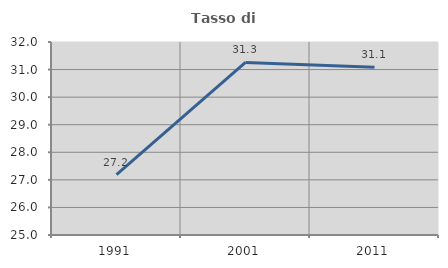
| Category | Tasso di occupazione   |
|---|---|
| 1991.0 | 27.193 |
| 2001.0 | 31.261 |
| 2011.0 | 31.085 |